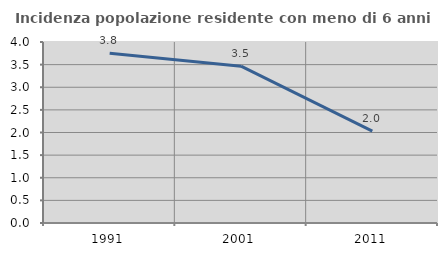
| Category | Incidenza popolazione residente con meno di 6 anni |
|---|---|
| 1991.0 | 3.75 |
| 2001.0 | 3.467 |
| 2011.0 | 2.029 |